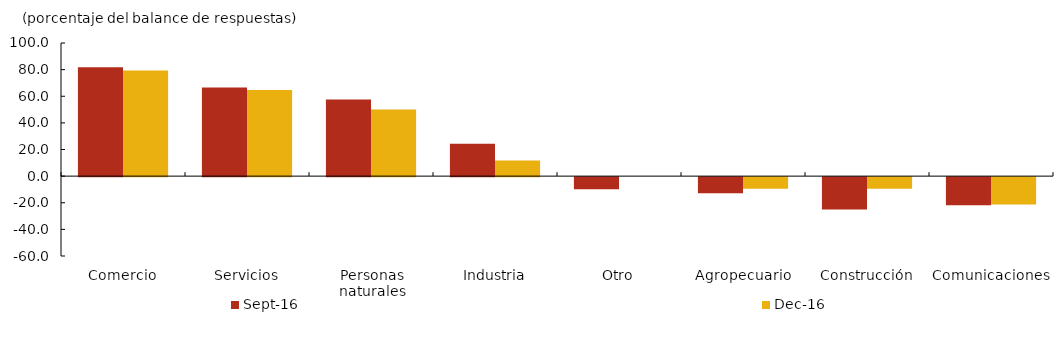
| Category | sep-16 | dic-16 |
|---|---|---|
| Comercio | 81.818 | 79.412 |
| Servicios | 66.667 | 64.706 |
| Personas naturales | 57.576 | 50 |
| Industria | 24.242 | 11.765 |
| Otro | -9.091 | 0 |
| Agropecuario | -12.121 | -8.824 |
| Construcción | -24.242 | -8.824 |
| Comunicaciones | -21.212 | -20.588 |